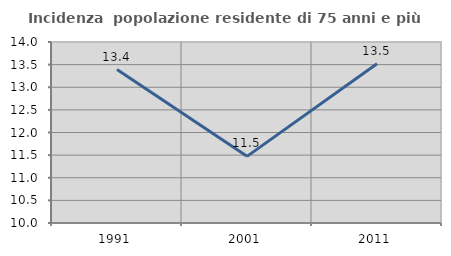
| Category | Incidenza  popolazione residente di 75 anni e più |
|---|---|
| 1991.0 | 13.39 |
| 2001.0 | 11.473 |
| 2011.0 | 13.518 |